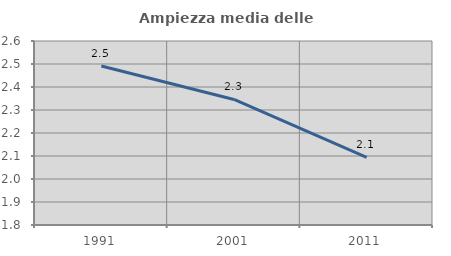
| Category | Ampiezza media delle famiglie |
|---|---|
| 1991.0 | 2.491 |
| 2001.0 | 2.346 |
| 2011.0 | 2.094 |